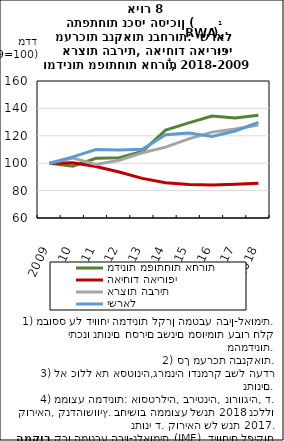
| Category | מדינות מפותחות אחרות | האיחוד האירופי | ארצות הברית | ישראל |
|---|---|---|---|---|
| 2009.0 | 100 | 100 | 100 | 100 |
| 2010.0 | 97.787 | 100.301 | 103.697 | 104.613 |
| 2011.0 | 103.643 | 97.567 | 99.112 | 110.034 |
| 2012.0 | 103.958 | 93.566 | 102.144 | 109.709 |
| 2013.0 | 108.649 | 88.939 | 107.581 | 110.134 |
| 2014.0 | 124.112 | 85.793 | 111.721 | 120.831 |
| 2015.0 | 129.395 | 84.41 | 117.767 | 122.117 |
| 2016.0 | 134.374 | 84.064 | 122.697 | 119.457 |
| 2017.0 | 132.952 | 84.565 | 125.02 | 123.521 |
| 2018.0 | 135.022 | 85.41 | 127.794 | 129.805 |